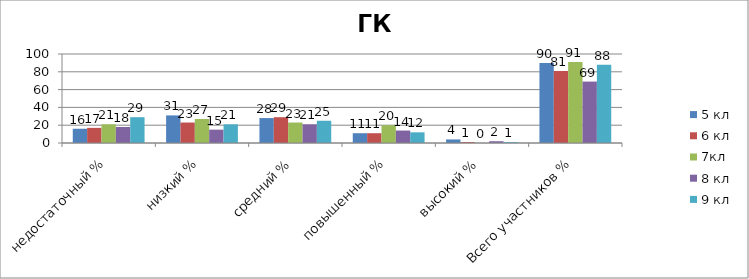
| Category | 5 кл | 6 кл | 7кл | 8 кл | 9 кл |
|---|---|---|---|---|---|
| недостаточный % | 16 | 17 | 21 | 18 | 29 |
| низкий % | 31 | 23 | 27 | 15 | 21 |
| средний % | 28 | 29 | 23 | 21 | 25 |
| повышенный % | 11 | 11 | 20 | 14 | 12 |
| высокий % | 4 | 1 | 0 | 2 | 1 |
| Всего участников % | 90 | 81 | 91 | 69 | 88 |